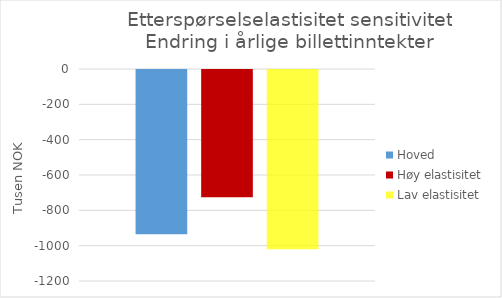
| Category | Hoved | Høy elastisitet | Lav elastisitet |
|---|---|---|---|
| 0 | -930.345 | -720.377 | -1014.317 |